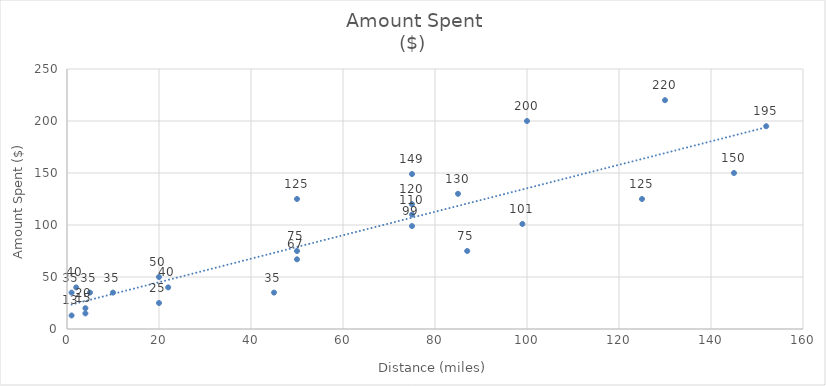
| Category | Amount Spent
($) |
|---|---|
| 1.0 | 35 |
| 1.0 | 13 |
| 2.0 | 40 |
| 4.0 | 20 |
| 4.0 | 15 |
| 5.0 | 35 |
| 10.0 | 35 |
| 20.0 | 50 |
| 20.0 | 25 |
| 22.0 | 40 |
| 45.0 | 35 |
| 50.0 | 75 |
| 50.0 | 125 |
| 50.0 | 67 |
| 75.0 | 99 |
| 75.0 | 149 |
| 75.0 | 110 |
| 75.0 | 120 |
| 85.0 | 130 |
| 87.0 | 75 |
| 99.0 | 101 |
| 100.0 | 200 |
| 125.0 | 125 |
| 130.0 | 220 |
| 145.0 | 150 |
| 152.0 | 195 |